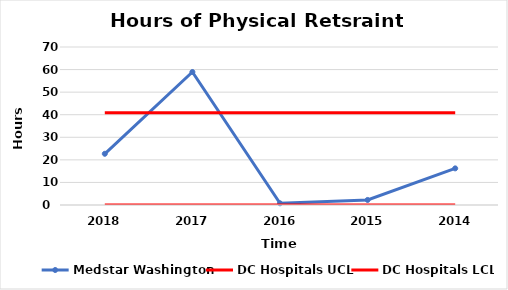
| Category | Medstar Washington | DC Hospitals UCL | DC Hospitals LCL |
|---|---|---|---|
| 2018.0 | 22.69 | 40.831 | 0 |
| 2017.0 | 58.93 | 40.831 | 0 |
| 2016.0 | 0.76 | 40.831 | 0 |
| 2015.0 | 2.24 | 40.831 | 0 |
| 2014.0 | 16.23 | 40.831 | 0 |